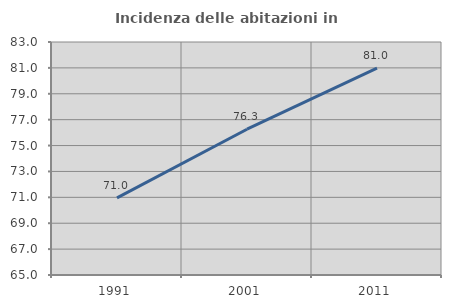
| Category | Incidenza delle abitazioni in proprietà  |
|---|---|
| 1991.0 | 70.96 |
| 2001.0 | 76.263 |
| 2011.0 | 80.98 |